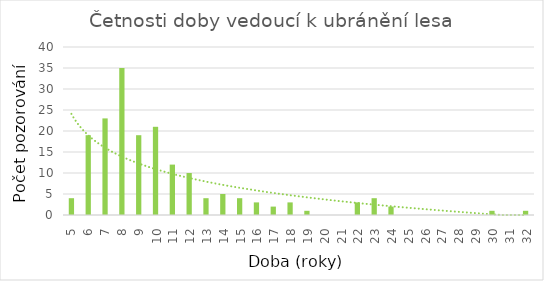
| Category | Četnosti doby |
|---|---|
| 5.0 | 4 |
| 6.0 | 19 |
| 7.0 | 23 |
| 8.0 | 35 |
| 9.0 | 19 |
| 10.0 | 21 |
| 11.0 | 12 |
| 12.0 | 10 |
| 13.0 | 4 |
| 14.0 | 5 |
| 15.0 | 4 |
| 16.0 | 3 |
| 17.0 | 2 |
| 18.0 | 3 |
| 19.0 | 1 |
| 20.0 | 0 |
| 21.0 | 0 |
| 22.0 | 3 |
| 23.0 | 4 |
| 24.0 | 2 |
| 25.0 | 0 |
| 26.0 | 0 |
| 27.0 | 0 |
| 28.0 | 0 |
| 29.0 | 0 |
| 30.0 | 1 |
| 31.0 | 0 |
| 32.0 | 1 |